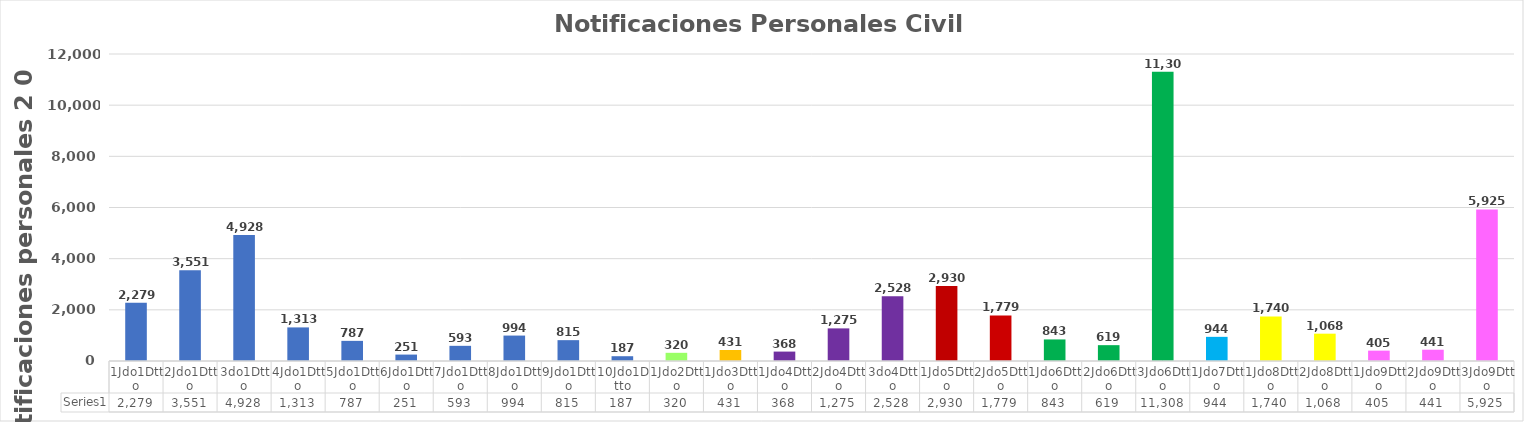
| Category | Series 0 |
|---|---|
| 1Jdo1Dtto | 2279 |
| 2Jdo1Dtto | 3551 |
| 3do1Dtto | 4928 |
| 4Jdo1Dtto | 1313 |
| 5Jdo1Dtto | 787 |
| 6Jdo1Dtto | 251 |
| 7Jdo1Dtto | 593 |
| 8Jdo1Dtto | 994 |
| 9Jdo1Dtto | 815 |
| 10Jdo1Dtto | 187 |
| 1Jdo2Dtto | 320 |
| 1Jdo3Dtto | 431 |
| 1Jdo4Dtto | 368 |
| 2Jdo4Dtto | 1275 |
| 3do4Dtto | 2528 |
| 1Jdo5Dtto | 2930 |
| 2Jdo5Dtto | 1779 |
| 1Jdo6Dtto | 843 |
| 2Jdo6Dtto | 619 |
| 3Jdo6Dtto | 11308 |
| 1Jdo7Dtto | 944 |
| 1Jdo8Dtto | 1740 |
| 2Jdo8Dtto | 1068 |
| 1Jdo9Dtto | 405 |
| 2Jdo9Dtto | 441 |
| 3Jdo9Dtto | 5925 |